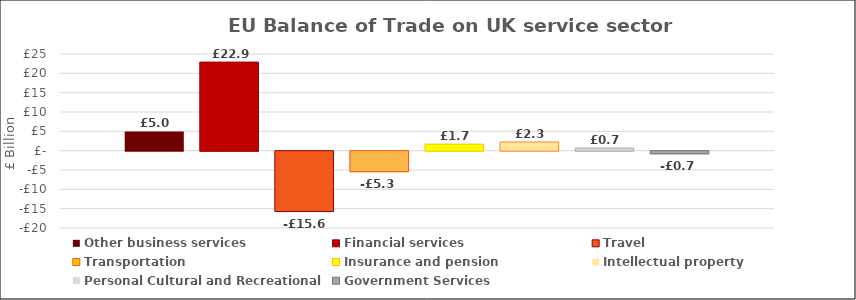
| Category |  Other business services  |  Financial services  |  Travel  |  Transportation  |  Insurance and pension  |  Intellectual property  |  Personal Cultural and Recreational  |  Government Services  |
|---|---|---|---|---|---|---|---|---|
| 0 | 4.976 | 22.903 | -15.615 | -5.304 | 1.697 | 2.25 | 0.666 | -0.688 |